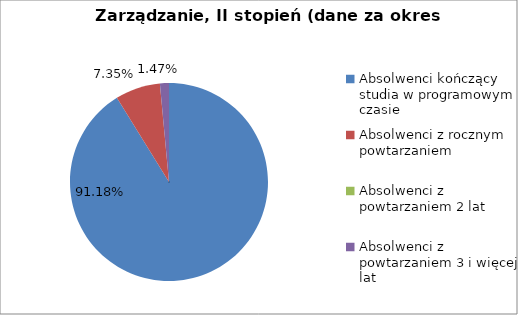
| Category | Series 0 |
|---|---|
| Absolwenci kończący studia w programowym czasie | 91.176 |
| Absolwenci z rocznym powtarzaniem | 7.353 |
| Absolwenci z powtarzaniem 2 lat | 0 |
| Absolwenci z powtarzaniem 3 i więcej lat | 1.471 |